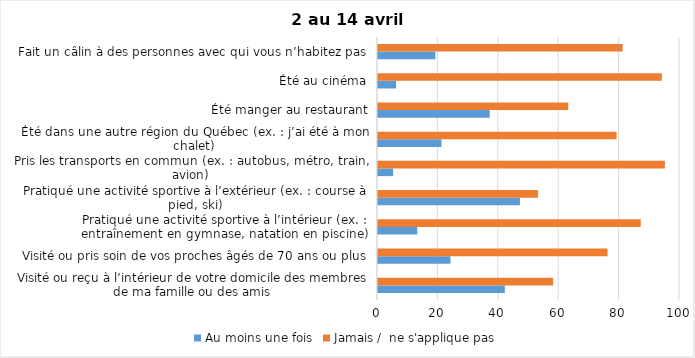
| Category | Au moins une fois | Jamais /  ne s'applique pas |
|---|---|---|
| Visité ou reçu à l’intérieur de votre domicile des membres de ma famille ou des amis | 42 | 58 |
| Visité ou pris soin de vos proches âgés de 70 ans ou plus | 24 | 76 |
| Pratiqué une activité sportive à l’intérieur (ex. : entraînement en gymnase, natation en piscine) | 13 | 87 |
| Pratiqué une activité sportive à l’extérieur (ex. : course à pied, ski) | 47 | 53 |
| Pris les transports en commun (ex. : autobus, métro, train, avion) | 5 | 95 |
| Été dans une autre région du Québec (ex. : j’ai été à mon chalet) | 21 | 79 |
| Été manger au restaurant | 37 | 63 |
| Été au cinéma | 6 | 94 |
| Fait un câlin à des personnes avec qui vous n’habitez pas | 19 | 81 |